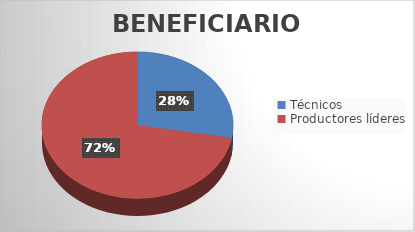
| Category | Series 0 |
|---|---|
| Técnicos | 83 |
| Productores líderes | 216 |